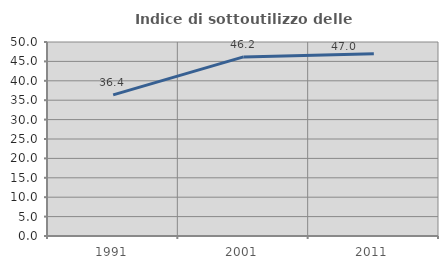
| Category | Indice di sottoutilizzo delle abitazioni  |
|---|---|
| 1991.0 | 36.364 |
| 2001.0 | 46.154 |
| 2011.0 | 46.988 |